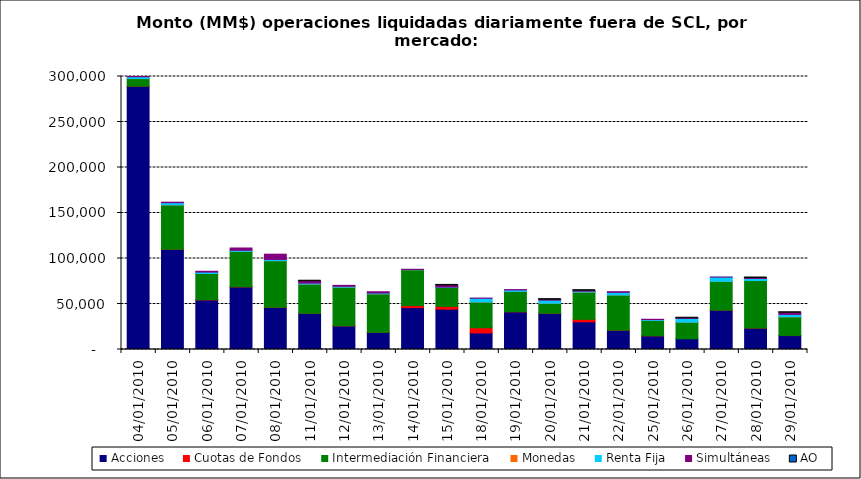
| Category | Acciones | Cuotas de Fondos | Intermediación Financiera | Monedas | Renta Fija | Simultáneas | AO |
|---|---|---|---|---|---|---|---|
| 04/01/2010 | 289298.024 | 86.903 | 8338.025 | 5.907 | 1978.038 | 395.094 | 0 |
| 05/01/2010 | 110050.078 | 129.031 | 48758.868 | 0.96 | 2385.779 | 555.497 | 0 |
| 06/01/2010 | 54482.929 | 244.975 | 28758.484 | 1.95 | 1579.101 | 896.375 | 0 |
| 07/01/2010 | 68795.971 | 116.73 | 38893.395 | 8.615 | 1178.336 | 2542.879 | 0 |
| 08/01/2010 | 46279.829 | 199.344 | 51126.38 | 1.9 | 1363.509 | 5773.127 | 0 |
| 11/01/2010 | 39744.039 | 21.409 | 32125.497 | 5.73 | 1055.226 | 2061.975 | 0.537 |
| 12/01/2010 | 25968.588 | 26.204 | 42454.132 | 1.9 | 970.207 | 1078.364 | 0 |
| 13/01/2010 | 18763.991 | 78.977 | 42309.626 | 34.2 | 877.931 | 1416.984 | 0 |
| 14/01/2010 | 46011.561 | 2211.162 | 39452.707 | 9.88 | 283.089 | 174.41 | 0 |
| 15/01/2010 | 44368.192 | 2978.478 | 20877.792 | 8.36 | 352.365 | 1847.035 | 0.007 |
| 18/01/2010 | 18211.89 | 5697.391 | 28277.805 | 4.94 | 4077.985 | 173.482 | 0 |
| 19/01/2010 | 41401.092 | 120.682 | 22329.544 | 11.4 | 1563.893 | 359.309 | 0 |
| 20/01/2010 | 39745.537 | 95.336 | 10980.963 | 9.49 | 3385.229 | 534.946 | 0.099 |
| 21/01/2010 | 30458.33 | 2668.184 | 30017.816 | 3.398 | 937.682 | 498.193 | 0.01 |
| 22/01/2010 | 21123.65 | 134.947 | 38575.852 | 0.378 | 2922.724 | 774.09 | 0 |
| 25/01/2010 | 15025.828 | 93.033 | 16808.553 | 1.506 | 958.902 | 319.191 | 0 |
| 26/01/2010 | 11775.185 | 0 | 18230.969 | 17.531 | 4201.587 | 113.587 | 2.102 |
| 27/01/2010 | 43307.758 | 0.923 | 31600.359 | 1.119 | 4621.847 | 61.401 | 0 |
| 28/01/2010 | 23517.497 | 63.566 | 52197.233 | 10.156 | 2291.965 | 454.806 | 0.057 |
| 29/01/2010 | 15281.147 | 138.897 | 20481.55 | 13.901 | 2619.226 | 1800.571 | 0.115 |